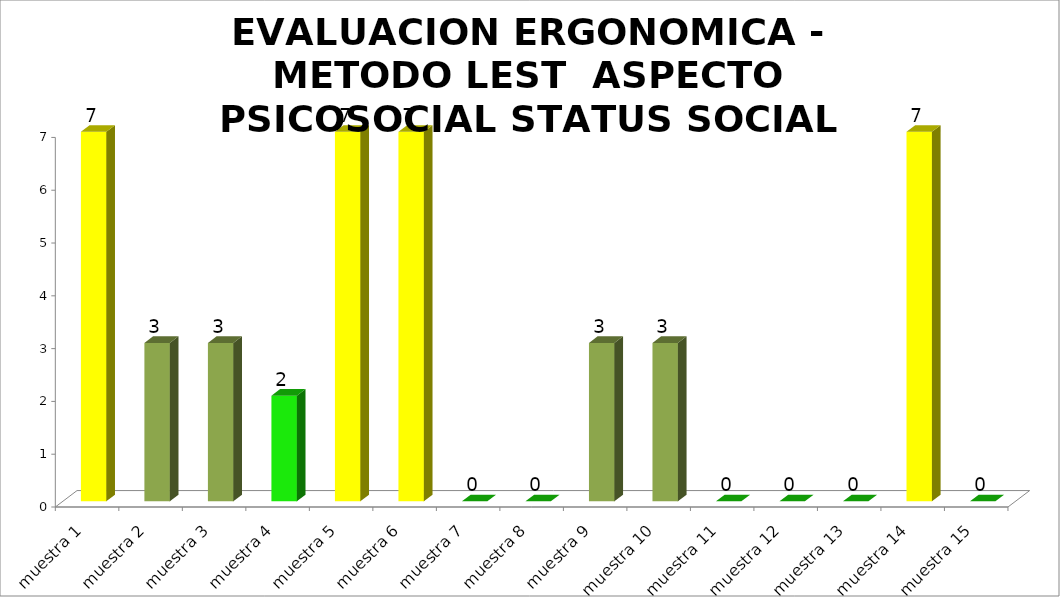
| Category | EVALUACION ERGONOMICA - METODO LEST  |
|---|---|
| muestra 1 | 7 |
| muestra 2 | 3 |
| muestra 3 | 3 |
| muestra 4 | 2 |
| muestra 5 | 7 |
| muestra 6 | 7 |
| muestra 7 | 0 |
| muestra 8 | 0 |
| muestra 9 | 3 |
| muestra 10 | 3 |
| muestra 11 | 0 |
| muestra 12 | 0 |
| muestra 13 | 0 |
| muestra 14 | 7 |
| muestra 15 | 0 |